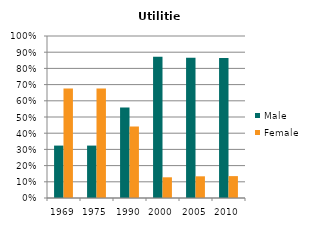
| Category | Male | Female |
|---|---|---|
| 1969.0 | 0.324 | 0.676 |
| 1975.0 | 0.324 | 0.676 |
| 1990.0 | 0.559 | 0.441 |
| 2000.0 | 0.872 | 0.128 |
| 2005.0 | 0.866 | 0.134 |
| 2010.0 | 0.865 | 0.135 |